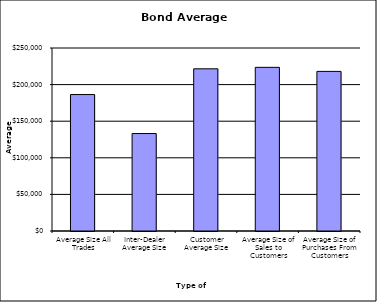
| Category | Security Type |
|---|---|
| Average Size All Trades | 186425.107 |
| Inter-Dealer Average Size | 133144.098 |
| Customer Average Size | 221568.399 |
| Average Size of Sales to Customers | 223582.138 |
| Average Size of Purchases From Customers | 218045.58 |